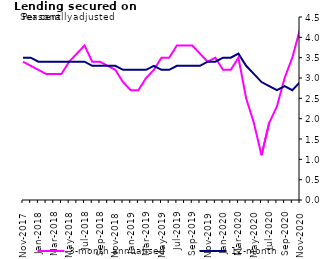
| Category | 3-month annualised | 12-month |
|---|---|---|
| Nov-2017 | 3.4 | 3.5 |
| Dec-2017 | 3.3 | 3.5 |
| Jan-2018 | 3.2 | 3.4 |
| Feb-2018 | 3.1 | 3.4 |
| Mar-2018 | 3.1 | 3.4 |
| Apr-2018 | 3.1 | 3.4 |
| May-2018 | 3.4 | 3.4 |
| Jun-2018 | 3.6 | 3.4 |
| Jul-2018 | 3.8 | 3.4 |
| Aug-2018 | 3.4 | 3.3 |
| Sep-2018 | 3.4 | 3.3 |
| Oct-2018 | 3.3 | 3.3 |
| Nov-2018 | 3.2 | 3.3 |
| Dec-2018 | 2.9 | 3.2 |
| Jan-2019 | 2.7 | 3.2 |
| Feb-2019 | 2.7 | 3.2 |
| Mar-2019 | 3 | 3.2 |
| Apr-2019 | 3.2 | 3.3 |
| May-2019 | 3.5 | 3.2 |
| Jun-2019 | 3.5 | 3.2 |
| Jul-2019 | 3.8 | 3.3 |
| Aug-2019 | 3.8 | 3.3 |
| Sep-2019 | 3.8 | 3.3 |
| Oct-2019 | 3.6 | 3.3 |
| Nov-2019 | 3.4 | 3.4 |
| Dec-2019 | 3.5 | 3.4 |
| Jan-2020 | 3.2 | 3.5 |
| Feb-2020 | 3.2 | 3.5 |
| Mar-2020 | 3.5 | 3.6 |
| Apr-2020 | 2.5 | 3.3 |
| May-2020 | 1.9 | 3.1 |
| Jun-2020 | 1.1 | 2.9 |
| Jul-2020 | 1.9 | 2.8 |
| Aug-2020 | 2.3 | 2.7 |
| Sep-2020 | 3 | 2.8 |
| Oct-2020 | 3.5 | 2.7 |
| Nov-2020 | 4.2 | 2.9 |